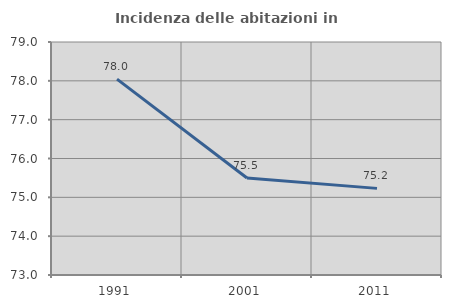
| Category | Incidenza delle abitazioni in proprietà  |
|---|---|
| 1991.0 | 78.044 |
| 2001.0 | 75.499 |
| 2011.0 | 75.231 |